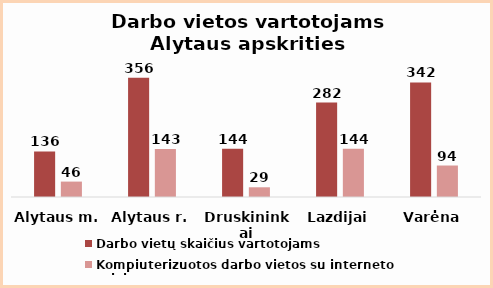
| Category | Darbo vietų skaičius vartotojams | Kompiuterizuotos darbo vietos su interneto prieiga |
|---|---|---|
| Alytaus m. | 136 | 46 |
| Alytaus r. | 356 | 143 |
| Druskininkai | 144 | 29 |
| Lazdijai | 282 | 144 |
| Varėna | 342 | 94 |